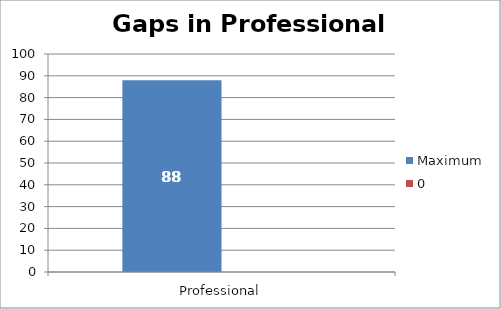
| Category | Maximum | 0 |
|---|---|---|
| Professional | 88 | 0 |